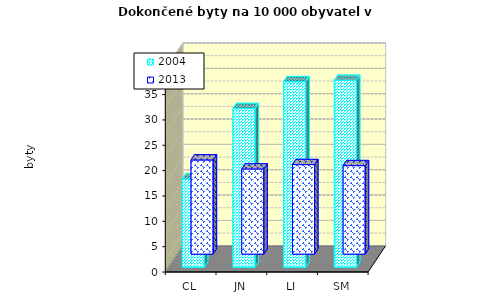
| Category | 2004 | 2013 |
|---|---|---|
| CL | 17.419 | 18.563 |
| JN | 31.304 | 16.787 |
| LI | 36.6 | 17.648 |
| SM | 36.862 | 17.448 |